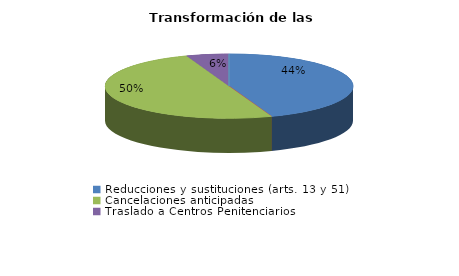
| Category | Series 0 |
|---|---|
| Reducciones y sustituciones (arts. 13 y 51) | 8 |
| Por quebrantamiento (art. 50.2) | 0 |
| Cancelaciones anticipadas | 9 |
| Traslado a Centros Penitenciarios | 1 |
| Conversión internamientos en cerrados (art. 51.2) | 0 |